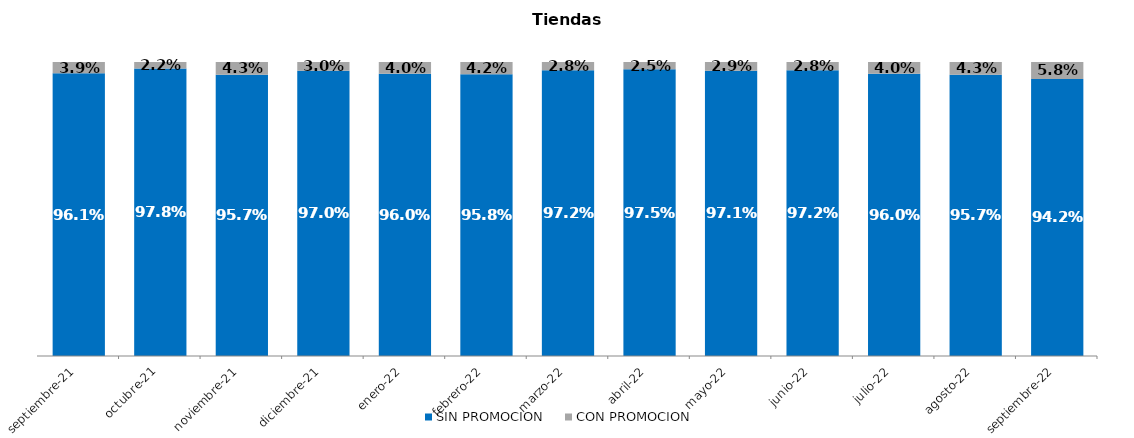
| Category | SIN PROMOCION   | CON PROMOCION   |
|---|---|---|
| 2021-09-01 | 0.961 | 0.039 |
| 2021-10-01 | 0.978 | 0.022 |
| 2021-11-01 | 0.957 | 0.043 |
| 2021-12-01 | 0.97 | 0.03 |
| 2022-01-01 | 0.96 | 0.04 |
| 2022-02-01 | 0.958 | 0.042 |
| 2022-03-01 | 0.972 | 0.028 |
| 2022-04-01 | 0.975 | 0.025 |
| 2022-05-01 | 0.971 | 0.029 |
| 2022-06-01 | 0.972 | 0.028 |
| 2022-07-01 | 0.96 | 0.04 |
| 2022-08-01 | 0.957 | 0.043 |
| 2022-09-01 | 0.942 | 0.058 |